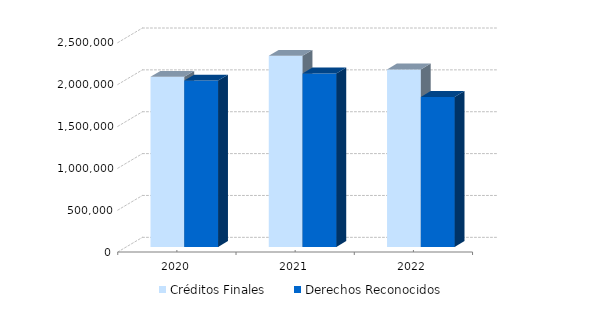
| Category | Créditos Finales | Derechos Reconocidos |
|---|---|---|
| 2020.0 | 2032170.41 | 1986206.58 |
| 2021.0 | 2283189.71 | 2072033.26 |
| 2022.0 | 2119170.78 | 1791617.35 |